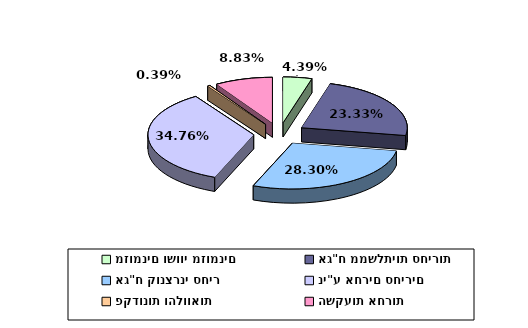
| Category | Series 0 |
|---|---|
| מזומנים ושווי מזומנים | 0.044 |
| אג"ח ממשלתיות סחירות | 0.233 |
| אג"ח קונצרני סחיר | 0.283 |
| ני"ע אחרים סחירים | 0.348 |
| פקדונות והלוואות | 0.004 |
| השקעות אחרות | 0.088 |